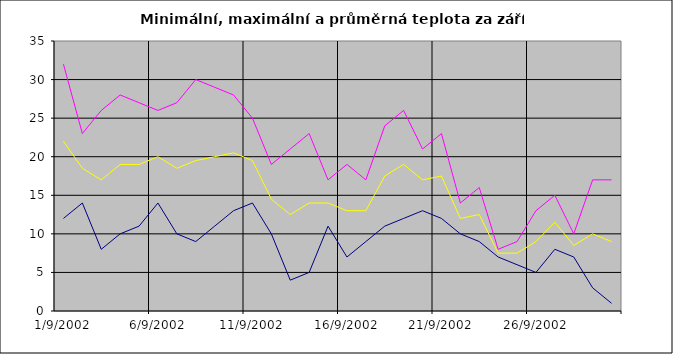
| Category | Series 0 | Series 1 | Series 2 |
|---|---|---|---|
| 2002-09-01 | 12 | 32 | 22 |
| 2002-09-02 | 14 | 23 | 18.5 |
| 2002-09-03 | 8 | 26 | 17 |
| 2002-09-04 | 10 | 28 | 19 |
| 2002-09-05 | 11 | 27 | 19 |
| 2002-09-06 | 14 | 26 | 20 |
| 2002-09-07 | 10 | 27 | 18.5 |
| 2002-09-08 | 9 | 30 | 19.5 |
| 2002-09-09 | 11 | 29 | 20 |
| 2002-09-10 | 13 | 28 | 20.5 |
| 2002-09-11 | 14 | 25 | 19.5 |
| 2002-09-12 | 10 | 19 | 14.5 |
| 2002-09-13 | 4 | 21 | 12.5 |
| 2002-09-14 | 5 | 23 | 14 |
| 2002-09-15 | 11 | 17 | 14 |
| 2002-09-16 | 7 | 19 | 13 |
| 2002-09-17 | 9 | 17 | 13 |
| 2002-09-18 | 11 | 24 | 17.5 |
| 2002-09-19 | 12 | 26 | 19 |
| 2002-09-20 | 13 | 21 | 17 |
| 2002-09-21 | 12 | 23 | 17.5 |
| 2002-09-22 | 10 | 14 | 12 |
| 2002-09-23 | 9 | 16 | 12.5 |
| 2002-09-24 | 7 | 8 | 7.5 |
| 2002-09-25 | 6 | 9 | 7.5 |
| 2002-09-26 | 5 | 13 | 9 |
| 2002-09-27 | 8 | 15 | 11.5 |
| 2002-09-28 | 7 | 10 | 8.5 |
| 2002-09-29 | 3 | 17 | 10 |
| 2002-09-30 | 1 | 17 | 9 |